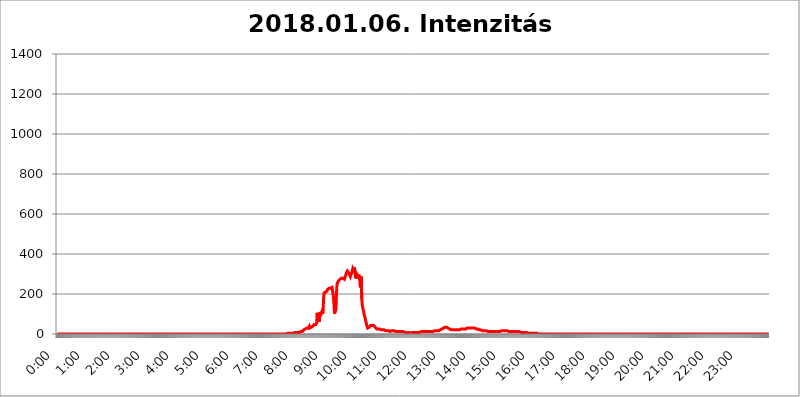
| Category | 2018.01.06. Intenzitás [W/m^2] |
|---|---|
| 0.0 | 0 |
| 0.0006944444444444445 | 0 |
| 0.001388888888888889 | 0 |
| 0.0020833333333333333 | 0 |
| 0.002777777777777778 | 0 |
| 0.003472222222222222 | 0 |
| 0.004166666666666667 | 0 |
| 0.004861111111111111 | 0 |
| 0.005555555555555556 | 0 |
| 0.0062499999999999995 | 0 |
| 0.006944444444444444 | 0 |
| 0.007638888888888889 | 0 |
| 0.008333333333333333 | 0 |
| 0.009027777777777779 | 0 |
| 0.009722222222222222 | 0 |
| 0.010416666666666666 | 0 |
| 0.011111111111111112 | 0 |
| 0.011805555555555555 | 0 |
| 0.012499999999999999 | 0 |
| 0.013194444444444444 | 0 |
| 0.013888888888888888 | 0 |
| 0.014583333333333332 | 0 |
| 0.015277777777777777 | 0 |
| 0.015972222222222224 | 0 |
| 0.016666666666666666 | 0 |
| 0.017361111111111112 | 0 |
| 0.018055555555555557 | 0 |
| 0.01875 | 0 |
| 0.019444444444444445 | 0 |
| 0.02013888888888889 | 0 |
| 0.020833333333333332 | 0 |
| 0.02152777777777778 | 0 |
| 0.022222222222222223 | 0 |
| 0.02291666666666667 | 0 |
| 0.02361111111111111 | 0 |
| 0.024305555555555556 | 0 |
| 0.024999999999999998 | 0 |
| 0.025694444444444447 | 0 |
| 0.02638888888888889 | 0 |
| 0.027083333333333334 | 0 |
| 0.027777777777777776 | 0 |
| 0.02847222222222222 | 0 |
| 0.029166666666666664 | 0 |
| 0.029861111111111113 | 0 |
| 0.030555555555555555 | 0 |
| 0.03125 | 0 |
| 0.03194444444444445 | 0 |
| 0.03263888888888889 | 0 |
| 0.03333333333333333 | 0 |
| 0.034027777777777775 | 0 |
| 0.034722222222222224 | 0 |
| 0.035416666666666666 | 0 |
| 0.036111111111111115 | 0 |
| 0.03680555555555556 | 0 |
| 0.0375 | 0 |
| 0.03819444444444444 | 0 |
| 0.03888888888888889 | 0 |
| 0.03958333333333333 | 0 |
| 0.04027777777777778 | 0 |
| 0.04097222222222222 | 0 |
| 0.041666666666666664 | 0 |
| 0.042361111111111106 | 0 |
| 0.04305555555555556 | 0 |
| 0.043750000000000004 | 0 |
| 0.044444444444444446 | 0 |
| 0.04513888888888889 | 0 |
| 0.04583333333333334 | 0 |
| 0.04652777777777778 | 0 |
| 0.04722222222222222 | 0 |
| 0.04791666666666666 | 0 |
| 0.04861111111111111 | 0 |
| 0.049305555555555554 | 0 |
| 0.049999999999999996 | 0 |
| 0.05069444444444445 | 0 |
| 0.051388888888888894 | 0 |
| 0.052083333333333336 | 0 |
| 0.05277777777777778 | 0 |
| 0.05347222222222222 | 0 |
| 0.05416666666666667 | 0 |
| 0.05486111111111111 | 0 |
| 0.05555555555555555 | 0 |
| 0.05625 | 0 |
| 0.05694444444444444 | 0 |
| 0.057638888888888885 | 0 |
| 0.05833333333333333 | 0 |
| 0.05902777777777778 | 0 |
| 0.059722222222222225 | 0 |
| 0.06041666666666667 | 0 |
| 0.061111111111111116 | 0 |
| 0.06180555555555556 | 0 |
| 0.0625 | 0 |
| 0.06319444444444444 | 0 |
| 0.06388888888888888 | 0 |
| 0.06458333333333334 | 0 |
| 0.06527777777777778 | 0 |
| 0.06597222222222222 | 0 |
| 0.06666666666666667 | 0 |
| 0.06736111111111111 | 0 |
| 0.06805555555555555 | 0 |
| 0.06874999999999999 | 0 |
| 0.06944444444444443 | 0 |
| 0.07013888888888889 | 0 |
| 0.07083333333333333 | 0 |
| 0.07152777777777779 | 0 |
| 0.07222222222222223 | 0 |
| 0.07291666666666667 | 0 |
| 0.07361111111111111 | 0 |
| 0.07430555555555556 | 0 |
| 0.075 | 0 |
| 0.07569444444444444 | 0 |
| 0.0763888888888889 | 0 |
| 0.07708333333333334 | 0 |
| 0.07777777777777778 | 0 |
| 0.07847222222222222 | 0 |
| 0.07916666666666666 | 0 |
| 0.0798611111111111 | 0 |
| 0.08055555555555556 | 0 |
| 0.08125 | 0 |
| 0.08194444444444444 | 0 |
| 0.08263888888888889 | 0 |
| 0.08333333333333333 | 0 |
| 0.08402777777777777 | 0 |
| 0.08472222222222221 | 0 |
| 0.08541666666666665 | 0 |
| 0.08611111111111112 | 0 |
| 0.08680555555555557 | 0 |
| 0.08750000000000001 | 0 |
| 0.08819444444444445 | 0 |
| 0.08888888888888889 | 0 |
| 0.08958333333333333 | 0 |
| 0.09027777777777778 | 0 |
| 0.09097222222222222 | 0 |
| 0.09166666666666667 | 0 |
| 0.09236111111111112 | 0 |
| 0.09305555555555556 | 0 |
| 0.09375 | 0 |
| 0.09444444444444444 | 0 |
| 0.09513888888888888 | 0 |
| 0.09583333333333333 | 0 |
| 0.09652777777777777 | 0 |
| 0.09722222222222222 | 0 |
| 0.09791666666666667 | 0 |
| 0.09861111111111111 | 0 |
| 0.09930555555555555 | 0 |
| 0.09999999999999999 | 0 |
| 0.10069444444444443 | 0 |
| 0.1013888888888889 | 0 |
| 0.10208333333333335 | 0 |
| 0.10277777777777779 | 0 |
| 0.10347222222222223 | 0 |
| 0.10416666666666667 | 0 |
| 0.10486111111111111 | 0 |
| 0.10555555555555556 | 0 |
| 0.10625 | 0 |
| 0.10694444444444444 | 0 |
| 0.1076388888888889 | 0 |
| 0.10833333333333334 | 0 |
| 0.10902777777777778 | 0 |
| 0.10972222222222222 | 0 |
| 0.1111111111111111 | 0 |
| 0.11180555555555556 | 0 |
| 0.11180555555555556 | 0 |
| 0.1125 | 0 |
| 0.11319444444444444 | 0 |
| 0.11388888888888889 | 0 |
| 0.11458333333333333 | 0 |
| 0.11527777777777777 | 0 |
| 0.11597222222222221 | 0 |
| 0.11666666666666665 | 0 |
| 0.1173611111111111 | 0 |
| 0.11805555555555557 | 0 |
| 0.11944444444444445 | 0 |
| 0.12013888888888889 | 0 |
| 0.12083333333333333 | 0 |
| 0.12152777777777778 | 0 |
| 0.12222222222222223 | 0 |
| 0.12291666666666667 | 0 |
| 0.12291666666666667 | 0 |
| 0.12361111111111112 | 0 |
| 0.12430555555555556 | 0 |
| 0.125 | 0 |
| 0.12569444444444444 | 0 |
| 0.12638888888888888 | 0 |
| 0.12708333333333333 | 0 |
| 0.16875 | 0 |
| 0.12847222222222224 | 0 |
| 0.12916666666666668 | 0 |
| 0.12986111111111112 | 0 |
| 0.13055555555555556 | 0 |
| 0.13125 | 0 |
| 0.13194444444444445 | 0 |
| 0.1326388888888889 | 0 |
| 0.13333333333333333 | 0 |
| 0.13402777777777777 | 0 |
| 0.13402777777777777 | 0 |
| 0.13472222222222222 | 0 |
| 0.13541666666666666 | 0 |
| 0.1361111111111111 | 0 |
| 0.13749999999999998 | 0 |
| 0.13819444444444443 | 0 |
| 0.1388888888888889 | 0 |
| 0.13958333333333334 | 0 |
| 0.14027777777777778 | 0 |
| 0.14097222222222222 | 0 |
| 0.14166666666666666 | 0 |
| 0.1423611111111111 | 0 |
| 0.14305555555555557 | 0 |
| 0.14375000000000002 | 0 |
| 0.14444444444444446 | 0 |
| 0.1451388888888889 | 0 |
| 0.1451388888888889 | 0 |
| 0.14652777777777778 | 0 |
| 0.14722222222222223 | 0 |
| 0.14791666666666667 | 0 |
| 0.1486111111111111 | 0 |
| 0.14930555555555555 | 0 |
| 0.15 | 0 |
| 0.15069444444444444 | 0 |
| 0.15138888888888888 | 0 |
| 0.15208333333333332 | 0 |
| 0.15277777777777776 | 0 |
| 0.15347222222222223 | 0 |
| 0.15416666666666667 | 0 |
| 0.15486111111111112 | 0 |
| 0.15555555555555556 | 0 |
| 0.15625 | 0 |
| 0.15694444444444444 | 0 |
| 0.15763888888888888 | 0 |
| 0.15833333333333333 | 0 |
| 0.15902777777777777 | 0 |
| 0.15972222222222224 | 0 |
| 0.16041666666666668 | 0 |
| 0.16111111111111112 | 0 |
| 0.16180555555555556 | 0 |
| 0.1625 | 0 |
| 0.16319444444444445 | 0 |
| 0.1638888888888889 | 0 |
| 0.16458333333333333 | 0 |
| 0.16527777777777777 | 0 |
| 0.16597222222222222 | 0 |
| 0.16666666666666666 | 0 |
| 0.1673611111111111 | 0 |
| 0.16805555555555554 | 0 |
| 0.16874999999999998 | 0 |
| 0.16944444444444443 | 0 |
| 0.17013888888888887 | 0 |
| 0.1708333333333333 | 0 |
| 0.17152777777777775 | 0 |
| 0.17222222222222225 | 0 |
| 0.1729166666666667 | 0 |
| 0.17361111111111113 | 0 |
| 0.17430555555555557 | 0 |
| 0.17500000000000002 | 0 |
| 0.17569444444444446 | 0 |
| 0.1763888888888889 | 0 |
| 0.17708333333333334 | 0 |
| 0.17777777777777778 | 0 |
| 0.17847222222222223 | 0 |
| 0.17916666666666667 | 0 |
| 0.1798611111111111 | 0 |
| 0.18055555555555555 | 0 |
| 0.18125 | 0 |
| 0.18194444444444444 | 0 |
| 0.1826388888888889 | 0 |
| 0.18333333333333335 | 0 |
| 0.1840277777777778 | 0 |
| 0.18472222222222223 | 0 |
| 0.18541666666666667 | 0 |
| 0.18611111111111112 | 0 |
| 0.18680555555555556 | 0 |
| 0.1875 | 0 |
| 0.18819444444444444 | 0 |
| 0.18888888888888888 | 0 |
| 0.18958333333333333 | 0 |
| 0.19027777777777777 | 0 |
| 0.1909722222222222 | 0 |
| 0.19166666666666665 | 0 |
| 0.19236111111111112 | 0 |
| 0.19305555555555554 | 0 |
| 0.19375 | 0 |
| 0.19444444444444445 | 0 |
| 0.1951388888888889 | 0 |
| 0.19583333333333333 | 0 |
| 0.19652777777777777 | 0 |
| 0.19722222222222222 | 0 |
| 0.19791666666666666 | 0 |
| 0.1986111111111111 | 0 |
| 0.19930555555555554 | 0 |
| 0.19999999999999998 | 0 |
| 0.20069444444444443 | 0 |
| 0.20138888888888887 | 0 |
| 0.2020833333333333 | 0 |
| 0.2027777777777778 | 0 |
| 0.2034722222222222 | 0 |
| 0.2041666666666667 | 0 |
| 0.20486111111111113 | 0 |
| 0.20555555555555557 | 0 |
| 0.20625000000000002 | 0 |
| 0.20694444444444446 | 0 |
| 0.2076388888888889 | 0 |
| 0.20833333333333334 | 0 |
| 0.20902777777777778 | 0 |
| 0.20972222222222223 | 0 |
| 0.21041666666666667 | 0 |
| 0.2111111111111111 | 0 |
| 0.21180555555555555 | 0 |
| 0.2125 | 0 |
| 0.21319444444444444 | 0 |
| 0.2138888888888889 | 0 |
| 0.21458333333333335 | 0 |
| 0.2152777777777778 | 0 |
| 0.21597222222222223 | 0 |
| 0.21666666666666667 | 0 |
| 0.21736111111111112 | 0 |
| 0.21805555555555556 | 0 |
| 0.21875 | 0 |
| 0.21944444444444444 | 0 |
| 0.22013888888888888 | 0 |
| 0.22083333333333333 | 0 |
| 0.22152777777777777 | 0 |
| 0.2222222222222222 | 0 |
| 0.22291666666666665 | 0 |
| 0.2236111111111111 | 0 |
| 0.22430555555555556 | 0 |
| 0.225 | 0 |
| 0.22569444444444445 | 0 |
| 0.2263888888888889 | 0 |
| 0.22708333333333333 | 0 |
| 0.22777777777777777 | 0 |
| 0.22847222222222222 | 0 |
| 0.22916666666666666 | 0 |
| 0.2298611111111111 | 0 |
| 0.23055555555555554 | 0 |
| 0.23124999999999998 | 0 |
| 0.23194444444444443 | 0 |
| 0.23263888888888887 | 0 |
| 0.2333333333333333 | 0 |
| 0.2340277777777778 | 0 |
| 0.2347222222222222 | 0 |
| 0.2354166666666667 | 0 |
| 0.23611111111111113 | 0 |
| 0.23680555555555557 | 0 |
| 0.23750000000000002 | 0 |
| 0.23819444444444446 | 0 |
| 0.2388888888888889 | 0 |
| 0.23958333333333334 | 0 |
| 0.24027777777777778 | 0 |
| 0.24097222222222223 | 0 |
| 0.24166666666666667 | 0 |
| 0.2423611111111111 | 0 |
| 0.24305555555555555 | 0 |
| 0.24375 | 0 |
| 0.24444444444444446 | 0 |
| 0.24513888888888888 | 0 |
| 0.24583333333333335 | 0 |
| 0.2465277777777778 | 0 |
| 0.24722222222222223 | 0 |
| 0.24791666666666667 | 0 |
| 0.24861111111111112 | 0 |
| 0.24930555555555556 | 0 |
| 0.25 | 0 |
| 0.25069444444444444 | 0 |
| 0.2513888888888889 | 0 |
| 0.2520833333333333 | 0 |
| 0.25277777777777777 | 0 |
| 0.2534722222222222 | 0 |
| 0.25416666666666665 | 0 |
| 0.2548611111111111 | 0 |
| 0.2555555555555556 | 0 |
| 0.25625000000000003 | 0 |
| 0.2569444444444445 | 0 |
| 0.2576388888888889 | 0 |
| 0.25833333333333336 | 0 |
| 0.2590277777777778 | 0 |
| 0.25972222222222224 | 0 |
| 0.2604166666666667 | 0 |
| 0.2611111111111111 | 0 |
| 0.26180555555555557 | 0 |
| 0.2625 | 0 |
| 0.26319444444444445 | 0 |
| 0.2638888888888889 | 0 |
| 0.26458333333333334 | 0 |
| 0.2652777777777778 | 0 |
| 0.2659722222222222 | 0 |
| 0.26666666666666666 | 0 |
| 0.2673611111111111 | 0 |
| 0.26805555555555555 | 0 |
| 0.26875 | 0 |
| 0.26944444444444443 | 0 |
| 0.2701388888888889 | 0 |
| 0.2708333333333333 | 0 |
| 0.27152777777777776 | 0 |
| 0.2722222222222222 | 0 |
| 0.27291666666666664 | 0 |
| 0.2736111111111111 | 0 |
| 0.2743055555555555 | 0 |
| 0.27499999999999997 | 0 |
| 0.27569444444444446 | 0 |
| 0.27638888888888885 | 0 |
| 0.27708333333333335 | 0 |
| 0.2777777777777778 | 0 |
| 0.27847222222222223 | 0 |
| 0.2791666666666667 | 0 |
| 0.2798611111111111 | 0 |
| 0.28055555555555556 | 0 |
| 0.28125 | 0 |
| 0.28194444444444444 | 0 |
| 0.2826388888888889 | 0 |
| 0.2833333333333333 | 0 |
| 0.28402777777777777 | 0 |
| 0.2847222222222222 | 0 |
| 0.28541666666666665 | 0 |
| 0.28611111111111115 | 0 |
| 0.28680555555555554 | 0 |
| 0.28750000000000003 | 0 |
| 0.2881944444444445 | 0 |
| 0.2888888888888889 | 0 |
| 0.28958333333333336 | 0 |
| 0.2902777777777778 | 0 |
| 0.29097222222222224 | 0 |
| 0.2916666666666667 | 0 |
| 0.2923611111111111 | 0 |
| 0.29305555555555557 | 0 |
| 0.29375 | 0 |
| 0.29444444444444445 | 0 |
| 0.2951388888888889 | 0 |
| 0.29583333333333334 | 0 |
| 0.2965277777777778 | 0 |
| 0.2972222222222222 | 0 |
| 0.29791666666666666 | 0 |
| 0.2986111111111111 | 0 |
| 0.29930555555555555 | 0 |
| 0.3 | 0 |
| 0.30069444444444443 | 0 |
| 0.3013888888888889 | 0 |
| 0.3020833333333333 | 0 |
| 0.30277777777777776 | 0 |
| 0.3034722222222222 | 0 |
| 0.30416666666666664 | 0 |
| 0.3048611111111111 | 0 |
| 0.3055555555555555 | 0 |
| 0.30624999999999997 | 0 |
| 0.3069444444444444 | 0 |
| 0.3076388888888889 | 0 |
| 0.30833333333333335 | 0 |
| 0.3090277777777778 | 0 |
| 0.30972222222222223 | 0 |
| 0.3104166666666667 | 0 |
| 0.3111111111111111 | 0 |
| 0.31180555555555556 | 0 |
| 0.3125 | 0 |
| 0.31319444444444444 | 0 |
| 0.3138888888888889 | 0 |
| 0.3145833333333333 | 0 |
| 0.31527777777777777 | 0 |
| 0.3159722222222222 | 0 |
| 0.31666666666666665 | 0 |
| 0.31736111111111115 | 0 |
| 0.31805555555555554 | 0 |
| 0.31875000000000003 | 0 |
| 0.3194444444444445 | 0 |
| 0.3201388888888889 | 0 |
| 0.32083333333333336 | 0 |
| 0.3215277777777778 | 3.525 |
| 0.32222222222222224 | 3.525 |
| 0.3229166666666667 | 3.525 |
| 0.3236111111111111 | 3.525 |
| 0.32430555555555557 | 3.525 |
| 0.325 | 3.525 |
| 0.32569444444444445 | 3.525 |
| 0.3263888888888889 | 3.525 |
| 0.32708333333333334 | 3.525 |
| 0.3277777777777778 | 3.525 |
| 0.3284722222222222 | 3.525 |
| 0.32916666666666666 | 3.525 |
| 0.3298611111111111 | 3.525 |
| 0.33055555555555555 | 3.525 |
| 0.33125 | 3.525 |
| 0.33194444444444443 | 3.525 |
| 0.3326388888888889 | 3.525 |
| 0.3333333333333333 | 7.887 |
| 0.3340277777777778 | 7.887 |
| 0.3347222222222222 | 7.887 |
| 0.3354166666666667 | 7.887 |
| 0.3361111111111111 | 7.887 |
| 0.3368055555555556 | 7.887 |
| 0.33749999999999997 | 7.887 |
| 0.33819444444444446 | 7.887 |
| 0.33888888888888885 | 7.887 |
| 0.33958333333333335 | 7.887 |
| 0.34027777777777773 | 7.887 |
| 0.34097222222222223 | 12.257 |
| 0.3416666666666666 | 12.257 |
| 0.3423611111111111 | 12.257 |
| 0.3430555555555555 | 12.257 |
| 0.34375 | 12.257 |
| 0.3444444444444445 | 16.636 |
| 0.3451388888888889 | 16.636 |
| 0.3458333333333334 | 21.024 |
| 0.34652777777777777 | 21.024 |
| 0.34722222222222227 | 21.024 |
| 0.34791666666666665 | 25.419 |
| 0.34861111111111115 | 25.419 |
| 0.34930555555555554 | 25.419 |
| 0.35000000000000003 | 29.823 |
| 0.3506944444444444 | 29.823 |
| 0.3513888888888889 | 34.234 |
| 0.3520833333333333 | 29.823 |
| 0.3527777777777778 | 29.823 |
| 0.3534722222222222 | 38.653 |
| 0.3541666666666667 | 29.823 |
| 0.3548611111111111 | 29.823 |
| 0.35555555555555557 | 29.823 |
| 0.35625 | 34.234 |
| 0.35694444444444445 | 34.234 |
| 0.3576388888888889 | 38.653 |
| 0.35833333333333334 | 38.653 |
| 0.3590277777777778 | 43.079 |
| 0.3597222222222222 | 43.079 |
| 0.36041666666666666 | 47.511 |
| 0.3611111111111111 | 43.079 |
| 0.36180555555555555 | 43.079 |
| 0.3625 | 47.511 |
| 0.36319444444444443 | 47.511 |
| 0.3638888888888889 | 56.398 |
| 0.3645833333333333 | 105.69 |
| 0.3652777777777778 | 83.205 |
| 0.3659722222222222 | 60.85 |
| 0.3666666666666667 | 74.246 |
| 0.3673611111111111 | 60.85 |
| 0.3680555555555556 | 65.31 |
| 0.36874999999999997 | 110.201 |
| 0.36944444444444446 | 92.184 |
| 0.37013888888888885 | 105.69 |
| 0.37083333333333335 | 110.201 |
| 0.37152777777777773 | 114.716 |
| 0.37222222222222223 | 101.184 |
| 0.3729166666666666 | 128.284 |
| 0.3736111111111111 | 178.264 |
| 0.3743055555555555 | 205.62 |
| 0.375 | 205.62 |
| 0.3756944444444445 | 210.182 |
| 0.3763888888888889 | 210.182 |
| 0.3770833333333334 | 210.182 |
| 0.37777777777777777 | 214.746 |
| 0.37847222222222227 | 214.746 |
| 0.37916666666666665 | 223.873 |
| 0.37986111111111115 | 223.873 |
| 0.38055555555555554 | 228.436 |
| 0.38125000000000003 | 228.436 |
| 0.3819444444444444 | 233 |
| 0.3826388888888889 | 233 |
| 0.3833333333333333 | 228.436 |
| 0.3840277777777778 | 228.436 |
| 0.3847222222222222 | 228.436 |
| 0.3854166666666667 | 233 |
| 0.3861111111111111 | 237.564 |
| 0.38680555555555557 | 228.436 |
| 0.3875 | 182.82 |
| 0.38819444444444445 | 141.884 |
| 0.3888888888888889 | 101.184 |
| 0.38958333333333334 | 101.184 |
| 0.3902777777777778 | 101.184 |
| 0.3909722222222222 | 128.284 |
| 0.39166666666666666 | 205.62 |
| 0.3923611111111111 | 246.689 |
| 0.39305555555555555 | 255.813 |
| 0.39375 | 260.373 |
| 0.39444444444444443 | 264.932 |
| 0.3951388888888889 | 264.932 |
| 0.3958333333333333 | 264.932 |
| 0.3965277777777778 | 274.047 |
| 0.3972222222222222 | 274.047 |
| 0.3979166666666667 | 278.603 |
| 0.3986111111111111 | 278.603 |
| 0.3993055555555556 | 278.603 |
| 0.39999999999999997 | 278.603 |
| 0.40069444444444446 | 278.603 |
| 0.40138888888888885 | 274.047 |
| 0.40208333333333335 | 274.047 |
| 0.40277777777777773 | 274.047 |
| 0.40347222222222223 | 283.156 |
| 0.4041666666666666 | 287.709 |
| 0.4048611111111111 | 296.808 |
| 0.4055555555555555 | 305.898 |
| 0.40625 | 305.898 |
| 0.4069444444444445 | 314.98 |
| 0.4076388888888889 | 314.98 |
| 0.4083333333333334 | 314.98 |
| 0.40902777777777777 | 305.898 |
| 0.40972222222222227 | 301.354 |
| 0.41041666666666665 | 301.354 |
| 0.41111111111111115 | 287.709 |
| 0.41180555555555554 | 296.808 |
| 0.41250000000000003 | 301.354 |
| 0.4131944444444444 | 305.898 |
| 0.4138888888888889 | 305.898 |
| 0.4145833333333333 | 328.584 |
| 0.4152777777777778 | 333.113 |
| 0.4159722222222222 | 319.517 |
| 0.4166666666666667 | 333.113 |
| 0.4173611111111111 | 314.98 |
| 0.41805555555555557 | 287.709 |
| 0.41875 | 278.603 |
| 0.41944444444444445 | 292.259 |
| 0.4201388888888889 | 278.603 |
| 0.42083333333333334 | 296.808 |
| 0.4215277777777778 | 292.259 |
| 0.4222222222222222 | 287.709 |
| 0.42291666666666666 | 296.808 |
| 0.4236111111111111 | 292.259 |
| 0.42430555555555555 | 274.047 |
| 0.425 | 233 |
| 0.42569444444444443 | 242.127 |
| 0.4263888888888889 | 287.709 |
| 0.4270833333333333 | 178.264 |
| 0.4277777777777778 | 146.423 |
| 0.4284722222222222 | 132.814 |
| 0.4291666666666667 | 119.235 |
| 0.4298611111111111 | 110.201 |
| 0.4305555555555556 | 96.682 |
| 0.43124999999999997 | 87.692 |
| 0.43194444444444446 | 78.722 |
| 0.43263888888888885 | 65.31 |
| 0.43333333333333335 | 56.398 |
| 0.43402777777777773 | 43.079 |
| 0.43472222222222223 | 38.653 |
| 0.4354166666666666 | 29.823 |
| 0.4361111111111111 | 29.823 |
| 0.4368055555555555 | 29.823 |
| 0.4375 | 34.234 |
| 0.4381944444444445 | 38.653 |
| 0.4388888888888889 | 38.653 |
| 0.4395833333333334 | 43.079 |
| 0.44027777777777777 | 43.079 |
| 0.44097222222222227 | 43.079 |
| 0.44166666666666665 | 43.079 |
| 0.44236111111111115 | 43.079 |
| 0.44305555555555554 | 43.079 |
| 0.44375000000000003 | 43.079 |
| 0.4444444444444444 | 38.653 |
| 0.4451388888888889 | 38.653 |
| 0.4458333333333333 | 34.234 |
| 0.4465277777777778 | 29.823 |
| 0.4472222222222222 | 29.823 |
| 0.4479166666666667 | 25.419 |
| 0.4486111111111111 | 25.419 |
| 0.44930555555555557 | 25.419 |
| 0.45 | 25.419 |
| 0.45069444444444445 | 25.419 |
| 0.4513888888888889 | 25.419 |
| 0.45208333333333334 | 25.419 |
| 0.4527777777777778 | 25.419 |
| 0.4534722222222222 | 25.419 |
| 0.45416666666666666 | 21.024 |
| 0.4548611111111111 | 21.024 |
| 0.45555555555555555 | 21.024 |
| 0.45625 | 21.024 |
| 0.45694444444444443 | 21.024 |
| 0.4576388888888889 | 21.024 |
| 0.4583333333333333 | 21.024 |
| 0.4590277777777778 | 21.024 |
| 0.4597222222222222 | 21.024 |
| 0.4604166666666667 | 16.636 |
| 0.4611111111111111 | 16.636 |
| 0.4618055555555556 | 16.636 |
| 0.46249999999999997 | 16.636 |
| 0.46319444444444446 | 16.636 |
| 0.46388888888888885 | 12.257 |
| 0.46458333333333335 | 16.636 |
| 0.46527777777777773 | 16.636 |
| 0.46597222222222223 | 16.636 |
| 0.4666666666666666 | 12.257 |
| 0.4673611111111111 | 16.636 |
| 0.4680555555555555 | 16.636 |
| 0.46875 | 16.636 |
| 0.4694444444444445 | 16.636 |
| 0.4701388888888889 | 16.636 |
| 0.4708333333333334 | 16.636 |
| 0.47152777777777777 | 16.636 |
| 0.47222222222222227 | 16.636 |
| 0.47291666666666665 | 16.636 |
| 0.47361111111111115 | 16.636 |
| 0.47430555555555554 | 16.636 |
| 0.47500000000000003 | 12.257 |
| 0.4756944444444444 | 12.257 |
| 0.4763888888888889 | 12.257 |
| 0.4770833333333333 | 12.257 |
| 0.4777777777777778 | 12.257 |
| 0.4784722222222222 | 12.257 |
| 0.4791666666666667 | 12.257 |
| 0.4798611111111111 | 12.257 |
| 0.48055555555555557 | 12.257 |
| 0.48125 | 12.257 |
| 0.48194444444444445 | 12.257 |
| 0.4826388888888889 | 12.257 |
| 0.48333333333333334 | 12.257 |
| 0.4840277777777778 | 12.257 |
| 0.4847222222222222 | 12.257 |
| 0.48541666666666666 | 12.257 |
| 0.4861111111111111 | 7.887 |
| 0.48680555555555555 | 7.887 |
| 0.4875 | 7.887 |
| 0.48819444444444443 | 7.887 |
| 0.4888888888888889 | 7.887 |
| 0.4895833333333333 | 7.887 |
| 0.4902777777777778 | 7.887 |
| 0.4909722222222222 | 7.887 |
| 0.4916666666666667 | 7.887 |
| 0.4923611111111111 | 7.887 |
| 0.4930555555555556 | 7.887 |
| 0.49374999999999997 | 7.887 |
| 0.49444444444444446 | 3.525 |
| 0.49513888888888885 | 3.525 |
| 0.49583333333333335 | 3.525 |
| 0.49652777777777773 | 7.887 |
| 0.49722222222222223 | 3.525 |
| 0.4979166666666666 | 7.887 |
| 0.4986111111111111 | 7.887 |
| 0.4993055555555555 | 7.887 |
| 0.5 | 7.887 |
| 0.5006944444444444 | 7.887 |
| 0.5013888888888889 | 7.887 |
| 0.5020833333333333 | 7.887 |
| 0.5027777777777778 | 7.887 |
| 0.5034722222222222 | 7.887 |
| 0.5041666666666667 | 7.887 |
| 0.5048611111111111 | 7.887 |
| 0.5055555555555555 | 7.887 |
| 0.50625 | 7.887 |
| 0.5069444444444444 | 7.887 |
| 0.5076388888888889 | 7.887 |
| 0.5083333333333333 | 7.887 |
| 0.5090277777777777 | 7.887 |
| 0.5097222222222222 | 7.887 |
| 0.5104166666666666 | 12.257 |
| 0.5111111111111112 | 7.887 |
| 0.5118055555555555 | 12.257 |
| 0.5125000000000001 | 12.257 |
| 0.5131944444444444 | 12.257 |
| 0.513888888888889 | 12.257 |
| 0.5145833333333333 | 12.257 |
| 0.5152777777777778 | 12.257 |
| 0.5159722222222222 | 12.257 |
| 0.5166666666666667 | 12.257 |
| 0.517361111111111 | 12.257 |
| 0.5180555555555556 | 12.257 |
| 0.5187499999999999 | 12.257 |
| 0.5194444444444445 | 12.257 |
| 0.5201388888888888 | 12.257 |
| 0.5208333333333334 | 12.257 |
| 0.5215277777777778 | 12.257 |
| 0.5222222222222223 | 12.257 |
| 0.5229166666666667 | 12.257 |
| 0.5236111111111111 | 12.257 |
| 0.5243055555555556 | 12.257 |
| 0.525 | 12.257 |
| 0.5256944444444445 | 12.257 |
| 0.5263888888888889 | 12.257 |
| 0.5270833333333333 | 12.257 |
| 0.5277777777777778 | 12.257 |
| 0.5284722222222222 | 12.257 |
| 0.5291666666666667 | 16.636 |
| 0.5298611111111111 | 16.636 |
| 0.5305555555555556 | 16.636 |
| 0.53125 | 16.636 |
| 0.5319444444444444 | 16.636 |
| 0.5326388888888889 | 12.257 |
| 0.5333333333333333 | 16.636 |
| 0.5340277777777778 | 16.636 |
| 0.5347222222222222 | 16.636 |
| 0.5354166666666667 | 16.636 |
| 0.5361111111111111 | 16.636 |
| 0.5368055555555555 | 21.024 |
| 0.5375 | 21.024 |
| 0.5381944444444444 | 21.024 |
| 0.5388888888888889 | 21.024 |
| 0.5395833333333333 | 25.419 |
| 0.5402777777777777 | 25.419 |
| 0.5409722222222222 | 29.823 |
| 0.5416666666666666 | 29.823 |
| 0.5423611111111112 | 34.234 |
| 0.5430555555555555 | 34.234 |
| 0.5437500000000001 | 34.234 |
| 0.5444444444444444 | 34.234 |
| 0.545138888888889 | 34.234 |
| 0.5458333333333333 | 34.234 |
| 0.5465277777777778 | 29.823 |
| 0.5472222222222222 | 29.823 |
| 0.5479166666666667 | 29.823 |
| 0.548611111111111 | 25.419 |
| 0.5493055555555556 | 25.419 |
| 0.5499999999999999 | 25.419 |
| 0.5506944444444445 | 21.024 |
| 0.5513888888888888 | 21.024 |
| 0.5520833333333334 | 21.024 |
| 0.5527777777777778 | 21.024 |
| 0.5534722222222223 | 21.024 |
| 0.5541666666666667 | 21.024 |
| 0.5548611111111111 | 21.024 |
| 0.5555555555555556 | 21.024 |
| 0.55625 | 21.024 |
| 0.5569444444444445 | 21.024 |
| 0.5576388888888889 | 21.024 |
| 0.5583333333333333 | 21.024 |
| 0.5590277777777778 | 21.024 |
| 0.5597222222222222 | 21.024 |
| 0.5604166666666667 | 21.024 |
| 0.5611111111111111 | 21.024 |
| 0.5618055555555556 | 21.024 |
| 0.5625 | 21.024 |
| 0.5631944444444444 | 21.024 |
| 0.5638888888888889 | 21.024 |
| 0.5645833333333333 | 21.024 |
| 0.5652777777777778 | 21.024 |
| 0.5659722222222222 | 21.024 |
| 0.5666666666666667 | 25.419 |
| 0.5673611111111111 | 25.419 |
| 0.5680555555555555 | 25.419 |
| 0.56875 | 25.419 |
| 0.5694444444444444 | 25.419 |
| 0.5701388888888889 | 25.419 |
| 0.5708333333333333 | 25.419 |
| 0.5715277777777777 | 25.419 |
| 0.5722222222222222 | 25.419 |
| 0.5729166666666666 | 25.419 |
| 0.5736111111111112 | 25.419 |
| 0.5743055555555555 | 25.419 |
| 0.5750000000000001 | 29.823 |
| 0.5756944444444444 | 29.823 |
| 0.576388888888889 | 29.823 |
| 0.5770833333333333 | 29.823 |
| 0.5777777777777778 | 29.823 |
| 0.5784722222222222 | 29.823 |
| 0.5791666666666667 | 29.823 |
| 0.579861111111111 | 29.823 |
| 0.5805555555555556 | 29.823 |
| 0.5812499999999999 | 29.823 |
| 0.5819444444444445 | 29.823 |
| 0.5826388888888888 | 29.823 |
| 0.5833333333333334 | 29.823 |
| 0.5840277777777778 | 29.823 |
| 0.5847222222222223 | 29.823 |
| 0.5854166666666667 | 29.823 |
| 0.5861111111111111 | 29.823 |
| 0.5868055555555556 | 29.823 |
| 0.5875 | 25.419 |
| 0.5881944444444445 | 25.419 |
| 0.5888888888888889 | 25.419 |
| 0.5895833333333333 | 25.419 |
| 0.5902777777777778 | 25.419 |
| 0.5909722222222222 | 21.024 |
| 0.5916666666666667 | 21.024 |
| 0.5923611111111111 | 21.024 |
| 0.5930555555555556 | 21.024 |
| 0.59375 | 21.024 |
| 0.5944444444444444 | 16.636 |
| 0.5951388888888889 | 16.636 |
| 0.5958333333333333 | 16.636 |
| 0.5965277777777778 | 16.636 |
| 0.5972222222222222 | 16.636 |
| 0.5979166666666667 | 16.636 |
| 0.5986111111111111 | 16.636 |
| 0.5993055555555555 | 16.636 |
| 0.6 | 16.636 |
| 0.6006944444444444 | 16.636 |
| 0.6013888888888889 | 16.636 |
| 0.6020833333333333 | 16.636 |
| 0.6027777777777777 | 12.257 |
| 0.6034722222222222 | 12.257 |
| 0.6041666666666666 | 12.257 |
| 0.6048611111111112 | 12.257 |
| 0.6055555555555555 | 12.257 |
| 0.6062500000000001 | 12.257 |
| 0.6069444444444444 | 12.257 |
| 0.607638888888889 | 12.257 |
| 0.6083333333333333 | 12.257 |
| 0.6090277777777778 | 16.636 |
| 0.6097222222222222 | 12.257 |
| 0.6104166666666667 | 12.257 |
| 0.611111111111111 | 12.257 |
| 0.6118055555555556 | 12.257 |
| 0.6124999999999999 | 12.257 |
| 0.6131944444444445 | 12.257 |
| 0.6138888888888888 | 12.257 |
| 0.6145833333333334 | 12.257 |
| 0.6152777777777778 | 12.257 |
| 0.6159722222222223 | 12.257 |
| 0.6166666666666667 | 12.257 |
| 0.6173611111111111 | 12.257 |
| 0.6180555555555556 | 12.257 |
| 0.61875 | 12.257 |
| 0.6194444444444445 | 12.257 |
| 0.6201388888888889 | 12.257 |
| 0.6208333333333333 | 12.257 |
| 0.6215277777777778 | 12.257 |
| 0.6222222222222222 | 16.636 |
| 0.6229166666666667 | 16.636 |
| 0.6236111111111111 | 16.636 |
| 0.6243055555555556 | 16.636 |
| 0.625 | 16.636 |
| 0.6256944444444444 | 16.636 |
| 0.6263888888888889 | 16.636 |
| 0.6270833333333333 | 16.636 |
| 0.6277777777777778 | 16.636 |
| 0.6284722222222222 | 16.636 |
| 0.6291666666666667 | 16.636 |
| 0.6298611111111111 | 16.636 |
| 0.6305555555555555 | 16.636 |
| 0.63125 | 16.636 |
| 0.6319444444444444 | 12.257 |
| 0.6326388888888889 | 12.257 |
| 0.6333333333333333 | 12.257 |
| 0.6340277777777777 | 12.257 |
| 0.6347222222222222 | 12.257 |
| 0.6354166666666666 | 12.257 |
| 0.6361111111111112 | 12.257 |
| 0.6368055555555555 | 12.257 |
| 0.6375000000000001 | 12.257 |
| 0.6381944444444444 | 7.887 |
| 0.638888888888889 | 7.887 |
| 0.6395833333333333 | 12.257 |
| 0.6402777777777778 | 7.887 |
| 0.6409722222222222 | 12.257 |
| 0.6416666666666667 | 12.257 |
| 0.642361111111111 | 12.257 |
| 0.6430555555555556 | 12.257 |
| 0.6437499999999999 | 12.257 |
| 0.6444444444444445 | 12.257 |
| 0.6451388888888888 | 12.257 |
| 0.6458333333333334 | 12.257 |
| 0.6465277777777778 | 12.257 |
| 0.6472222222222223 | 12.257 |
| 0.6479166666666667 | 12.257 |
| 0.6486111111111111 | 7.887 |
| 0.6493055555555556 | 7.887 |
| 0.65 | 7.887 |
| 0.6506944444444445 | 12.257 |
| 0.6513888888888889 | 12.257 |
| 0.6520833333333333 | 7.887 |
| 0.6527777777777778 | 7.887 |
| 0.6534722222222222 | 7.887 |
| 0.6541666666666667 | 7.887 |
| 0.6548611111111111 | 7.887 |
| 0.6555555555555556 | 7.887 |
| 0.65625 | 7.887 |
| 0.6569444444444444 | 7.887 |
| 0.6576388888888889 | 7.887 |
| 0.6583333333333333 | 7.887 |
| 0.6590277777777778 | 7.887 |
| 0.6597222222222222 | 7.887 |
| 0.6604166666666667 | 3.525 |
| 0.6611111111111111 | 3.525 |
| 0.6618055555555555 | 3.525 |
| 0.6625 | 3.525 |
| 0.6631944444444444 | 3.525 |
| 0.6638888888888889 | 3.525 |
| 0.6645833333333333 | 3.525 |
| 0.6652777777777777 | 3.525 |
| 0.6659722222222222 | 3.525 |
| 0.6666666666666666 | 3.525 |
| 0.6673611111111111 | 3.525 |
| 0.6680555555555556 | 3.525 |
| 0.6687500000000001 | 3.525 |
| 0.6694444444444444 | 3.525 |
| 0.6701388888888888 | 3.525 |
| 0.6708333333333334 | 3.525 |
| 0.6715277777777778 | 3.525 |
| 0.6722222222222222 | 3.525 |
| 0.6729166666666666 | 3.525 |
| 0.6736111111111112 | 3.525 |
| 0.6743055555555556 | 3.525 |
| 0.6749999999999999 | 0 |
| 0.6756944444444444 | 0 |
| 0.6763888888888889 | 0 |
| 0.6770833333333334 | 0 |
| 0.6777777777777777 | 0 |
| 0.6784722222222223 | 0 |
| 0.6791666666666667 | 0 |
| 0.6798611111111111 | 0 |
| 0.6805555555555555 | 0 |
| 0.68125 | 0 |
| 0.6819444444444445 | 0 |
| 0.6826388888888889 | 0 |
| 0.6833333333333332 | 0 |
| 0.6840277777777778 | 0 |
| 0.6847222222222222 | 0 |
| 0.6854166666666667 | 0 |
| 0.686111111111111 | 0 |
| 0.6868055555555556 | 0 |
| 0.6875 | 0 |
| 0.6881944444444444 | 0 |
| 0.688888888888889 | 0 |
| 0.6895833333333333 | 0 |
| 0.6902777777777778 | 0 |
| 0.6909722222222222 | 0 |
| 0.6916666666666668 | 0 |
| 0.6923611111111111 | 0 |
| 0.6930555555555555 | 0 |
| 0.69375 | 0 |
| 0.6944444444444445 | 0 |
| 0.6951388888888889 | 0 |
| 0.6958333333333333 | 0 |
| 0.6965277777777777 | 0 |
| 0.6972222222222223 | 0 |
| 0.6979166666666666 | 0 |
| 0.6986111111111111 | 0 |
| 0.6993055555555556 | 0 |
| 0.7000000000000001 | 0 |
| 0.7006944444444444 | 0 |
| 0.7013888888888888 | 0 |
| 0.7020833333333334 | 0 |
| 0.7027777777777778 | 0 |
| 0.7034722222222222 | 0 |
| 0.7041666666666666 | 0 |
| 0.7048611111111112 | 0 |
| 0.7055555555555556 | 0 |
| 0.7062499999999999 | 0 |
| 0.7069444444444444 | 0 |
| 0.7076388888888889 | 0 |
| 0.7083333333333334 | 0 |
| 0.7090277777777777 | 0 |
| 0.7097222222222223 | 0 |
| 0.7104166666666667 | 0 |
| 0.7111111111111111 | 0 |
| 0.7118055555555555 | 0 |
| 0.7125 | 0 |
| 0.7131944444444445 | 0 |
| 0.7138888888888889 | 0 |
| 0.7145833333333332 | 0 |
| 0.7152777777777778 | 0 |
| 0.7159722222222222 | 0 |
| 0.7166666666666667 | 0 |
| 0.717361111111111 | 0 |
| 0.7180555555555556 | 0 |
| 0.71875 | 0 |
| 0.7194444444444444 | 0 |
| 0.720138888888889 | 0 |
| 0.7208333333333333 | 0 |
| 0.7215277777777778 | 0 |
| 0.7222222222222222 | 0 |
| 0.7229166666666668 | 0 |
| 0.7236111111111111 | 0 |
| 0.7243055555555555 | 0 |
| 0.725 | 0 |
| 0.7256944444444445 | 0 |
| 0.7263888888888889 | 0 |
| 0.7270833333333333 | 0 |
| 0.7277777777777777 | 0 |
| 0.7284722222222223 | 0 |
| 0.7291666666666666 | 0 |
| 0.7298611111111111 | 0 |
| 0.7305555555555556 | 0 |
| 0.7312500000000001 | 0 |
| 0.7319444444444444 | 0 |
| 0.7326388888888888 | 0 |
| 0.7333333333333334 | 0 |
| 0.7340277777777778 | 0 |
| 0.7347222222222222 | 0 |
| 0.7354166666666666 | 0 |
| 0.7361111111111112 | 0 |
| 0.7368055555555556 | 0 |
| 0.7374999999999999 | 0 |
| 0.7381944444444444 | 0 |
| 0.7388888888888889 | 0 |
| 0.7395833333333334 | 0 |
| 0.7402777777777777 | 0 |
| 0.7409722222222223 | 0 |
| 0.7416666666666667 | 0 |
| 0.7423611111111111 | 0 |
| 0.7430555555555555 | 0 |
| 0.74375 | 0 |
| 0.7444444444444445 | 0 |
| 0.7451388888888889 | 0 |
| 0.7458333333333332 | 0 |
| 0.7465277777777778 | 0 |
| 0.7472222222222222 | 0 |
| 0.7479166666666667 | 0 |
| 0.748611111111111 | 0 |
| 0.7493055555555556 | 0 |
| 0.75 | 0 |
| 0.7506944444444444 | 0 |
| 0.751388888888889 | 0 |
| 0.7520833333333333 | 0 |
| 0.7527777777777778 | 0 |
| 0.7534722222222222 | 0 |
| 0.7541666666666668 | 0 |
| 0.7548611111111111 | 0 |
| 0.7555555555555555 | 0 |
| 0.75625 | 0 |
| 0.7569444444444445 | 0 |
| 0.7576388888888889 | 0 |
| 0.7583333333333333 | 0 |
| 0.7590277777777777 | 0 |
| 0.7597222222222223 | 0 |
| 0.7604166666666666 | 0 |
| 0.7611111111111111 | 0 |
| 0.7618055555555556 | 0 |
| 0.7625000000000001 | 0 |
| 0.7631944444444444 | 0 |
| 0.7638888888888888 | 0 |
| 0.7645833333333334 | 0 |
| 0.7652777777777778 | 0 |
| 0.7659722222222222 | 0 |
| 0.7666666666666666 | 0 |
| 0.7673611111111112 | 0 |
| 0.7680555555555556 | 0 |
| 0.7687499999999999 | 0 |
| 0.7694444444444444 | 0 |
| 0.7701388888888889 | 0 |
| 0.7708333333333334 | 0 |
| 0.7715277777777777 | 0 |
| 0.7722222222222223 | 0 |
| 0.7729166666666667 | 0 |
| 0.7736111111111111 | 0 |
| 0.7743055555555555 | 0 |
| 0.775 | 0 |
| 0.7756944444444445 | 0 |
| 0.7763888888888889 | 0 |
| 0.7770833333333332 | 0 |
| 0.7777777777777778 | 0 |
| 0.7784722222222222 | 0 |
| 0.7791666666666667 | 0 |
| 0.779861111111111 | 0 |
| 0.7805555555555556 | 0 |
| 0.78125 | 0 |
| 0.7819444444444444 | 0 |
| 0.782638888888889 | 0 |
| 0.7833333333333333 | 0 |
| 0.7840277777777778 | 0 |
| 0.7847222222222222 | 0 |
| 0.7854166666666668 | 0 |
| 0.7861111111111111 | 0 |
| 0.7868055555555555 | 0 |
| 0.7875 | 0 |
| 0.7881944444444445 | 0 |
| 0.7888888888888889 | 0 |
| 0.7895833333333333 | 0 |
| 0.7902777777777777 | 0 |
| 0.7909722222222223 | 0 |
| 0.7916666666666666 | 0 |
| 0.7923611111111111 | 0 |
| 0.7930555555555556 | 0 |
| 0.7937500000000001 | 0 |
| 0.7944444444444444 | 0 |
| 0.7951388888888888 | 0 |
| 0.7958333333333334 | 0 |
| 0.7965277777777778 | 0 |
| 0.7972222222222222 | 0 |
| 0.7979166666666666 | 0 |
| 0.7986111111111112 | 0 |
| 0.7993055555555556 | 0 |
| 0.7999999999999999 | 0 |
| 0.8006944444444444 | 0 |
| 0.8013888888888889 | 0 |
| 0.8020833333333334 | 0 |
| 0.8027777777777777 | 0 |
| 0.8034722222222223 | 0 |
| 0.8041666666666667 | 0 |
| 0.8048611111111111 | 0 |
| 0.8055555555555555 | 0 |
| 0.80625 | 0 |
| 0.8069444444444445 | 0 |
| 0.8076388888888889 | 0 |
| 0.8083333333333332 | 0 |
| 0.8090277777777778 | 0 |
| 0.8097222222222222 | 0 |
| 0.8104166666666667 | 0 |
| 0.811111111111111 | 0 |
| 0.8118055555555556 | 0 |
| 0.8125 | 0 |
| 0.8131944444444444 | 0 |
| 0.813888888888889 | 0 |
| 0.8145833333333333 | 0 |
| 0.8152777777777778 | 0 |
| 0.8159722222222222 | 0 |
| 0.8166666666666668 | 0 |
| 0.8173611111111111 | 0 |
| 0.8180555555555555 | 0 |
| 0.81875 | 0 |
| 0.8194444444444445 | 0 |
| 0.8201388888888889 | 0 |
| 0.8208333333333333 | 0 |
| 0.8215277777777777 | 0 |
| 0.8222222222222223 | 0 |
| 0.8229166666666666 | 0 |
| 0.8236111111111111 | 0 |
| 0.8243055555555556 | 0 |
| 0.8250000000000001 | 0 |
| 0.8256944444444444 | 0 |
| 0.8263888888888888 | 0 |
| 0.8270833333333334 | 0 |
| 0.8277777777777778 | 0 |
| 0.8284722222222222 | 0 |
| 0.8291666666666666 | 0 |
| 0.8298611111111112 | 0 |
| 0.8305555555555556 | 0 |
| 0.8312499999999999 | 0 |
| 0.8319444444444444 | 0 |
| 0.8326388888888889 | 0 |
| 0.8333333333333334 | 0 |
| 0.8340277777777777 | 0 |
| 0.8347222222222223 | 0 |
| 0.8354166666666667 | 0 |
| 0.8361111111111111 | 0 |
| 0.8368055555555555 | 0 |
| 0.8375 | 0 |
| 0.8381944444444445 | 0 |
| 0.8388888888888889 | 0 |
| 0.8395833333333332 | 0 |
| 0.8402777777777778 | 0 |
| 0.8409722222222222 | 0 |
| 0.8416666666666667 | 0 |
| 0.842361111111111 | 0 |
| 0.8430555555555556 | 0 |
| 0.84375 | 0 |
| 0.8444444444444444 | 0 |
| 0.845138888888889 | 0 |
| 0.8458333333333333 | 0 |
| 0.8465277777777778 | 0 |
| 0.8472222222222222 | 0 |
| 0.8479166666666668 | 0 |
| 0.8486111111111111 | 0 |
| 0.8493055555555555 | 0 |
| 0.85 | 0 |
| 0.8506944444444445 | 0 |
| 0.8513888888888889 | 0 |
| 0.8520833333333333 | 0 |
| 0.8527777777777777 | 0 |
| 0.8534722222222223 | 0 |
| 0.8541666666666666 | 0 |
| 0.8548611111111111 | 0 |
| 0.8555555555555556 | 0 |
| 0.8562500000000001 | 0 |
| 0.8569444444444444 | 0 |
| 0.8576388888888888 | 0 |
| 0.8583333333333334 | 0 |
| 0.8590277777777778 | 0 |
| 0.8597222222222222 | 0 |
| 0.8604166666666666 | 0 |
| 0.8611111111111112 | 0 |
| 0.8618055555555556 | 0 |
| 0.8624999999999999 | 0 |
| 0.8631944444444444 | 0 |
| 0.8638888888888889 | 0 |
| 0.8645833333333334 | 0 |
| 0.8652777777777777 | 0 |
| 0.8659722222222223 | 0 |
| 0.8666666666666667 | 0 |
| 0.8673611111111111 | 0 |
| 0.8680555555555555 | 0 |
| 0.86875 | 0 |
| 0.8694444444444445 | 0 |
| 0.8701388888888889 | 0 |
| 0.8708333333333332 | 0 |
| 0.8715277777777778 | 0 |
| 0.8722222222222222 | 0 |
| 0.8729166666666667 | 0 |
| 0.873611111111111 | 0 |
| 0.8743055555555556 | 0 |
| 0.875 | 0 |
| 0.8756944444444444 | 0 |
| 0.876388888888889 | 0 |
| 0.8770833333333333 | 0 |
| 0.8777777777777778 | 0 |
| 0.8784722222222222 | 0 |
| 0.8791666666666668 | 0 |
| 0.8798611111111111 | 0 |
| 0.8805555555555555 | 0 |
| 0.88125 | 0 |
| 0.8819444444444445 | 0 |
| 0.8826388888888889 | 0 |
| 0.8833333333333333 | 0 |
| 0.8840277777777777 | 0 |
| 0.8847222222222223 | 0 |
| 0.8854166666666666 | 0 |
| 0.8861111111111111 | 0 |
| 0.8868055555555556 | 0 |
| 0.8875000000000001 | 0 |
| 0.8881944444444444 | 0 |
| 0.8888888888888888 | 0 |
| 0.8895833333333334 | 0 |
| 0.8902777777777778 | 0 |
| 0.8909722222222222 | 0 |
| 0.8916666666666666 | 0 |
| 0.8923611111111112 | 0 |
| 0.8930555555555556 | 0 |
| 0.8937499999999999 | 0 |
| 0.8944444444444444 | 0 |
| 0.8951388888888889 | 0 |
| 0.8958333333333334 | 0 |
| 0.8965277777777777 | 0 |
| 0.8972222222222223 | 0 |
| 0.8979166666666667 | 0 |
| 0.8986111111111111 | 0 |
| 0.8993055555555555 | 0 |
| 0.9 | 0 |
| 0.9006944444444445 | 0 |
| 0.9013888888888889 | 0 |
| 0.9020833333333332 | 0 |
| 0.9027777777777778 | 0 |
| 0.9034722222222222 | 0 |
| 0.9041666666666667 | 0 |
| 0.904861111111111 | 0 |
| 0.9055555555555556 | 0 |
| 0.90625 | 0 |
| 0.9069444444444444 | 0 |
| 0.907638888888889 | 0 |
| 0.9083333333333333 | 0 |
| 0.9090277777777778 | 0 |
| 0.9097222222222222 | 0 |
| 0.9104166666666668 | 0 |
| 0.9111111111111111 | 0 |
| 0.9118055555555555 | 0 |
| 0.9125 | 0 |
| 0.9131944444444445 | 0 |
| 0.9138888888888889 | 0 |
| 0.9145833333333333 | 0 |
| 0.9152777777777777 | 0 |
| 0.9159722222222223 | 0 |
| 0.9166666666666666 | 0 |
| 0.9173611111111111 | 0 |
| 0.9180555555555556 | 0 |
| 0.9187500000000001 | 0 |
| 0.9194444444444444 | 0 |
| 0.9201388888888888 | 0 |
| 0.9208333333333334 | 0 |
| 0.9215277777777778 | 0 |
| 0.9222222222222222 | 0 |
| 0.9229166666666666 | 0 |
| 0.9236111111111112 | 0 |
| 0.9243055555555556 | 0 |
| 0.9249999999999999 | 0 |
| 0.9256944444444444 | 0 |
| 0.9263888888888889 | 0 |
| 0.9270833333333334 | 0 |
| 0.9277777777777777 | 0 |
| 0.9284722222222223 | 0 |
| 0.9291666666666667 | 0 |
| 0.9298611111111111 | 0 |
| 0.9305555555555555 | 0 |
| 0.93125 | 0 |
| 0.9319444444444445 | 0 |
| 0.9326388888888889 | 0 |
| 0.9333333333333332 | 0 |
| 0.9340277777777778 | 0 |
| 0.9347222222222222 | 0 |
| 0.9354166666666667 | 0 |
| 0.936111111111111 | 0 |
| 0.9368055555555556 | 0 |
| 0.9375 | 0 |
| 0.9381944444444444 | 0 |
| 0.938888888888889 | 0 |
| 0.9395833333333333 | 0 |
| 0.9402777777777778 | 0 |
| 0.9409722222222222 | 0 |
| 0.9416666666666668 | 0 |
| 0.9423611111111111 | 0 |
| 0.9430555555555555 | 0 |
| 0.94375 | 0 |
| 0.9444444444444445 | 0 |
| 0.9451388888888889 | 0 |
| 0.9458333333333333 | 0 |
| 0.9465277777777777 | 0 |
| 0.9472222222222223 | 0 |
| 0.9479166666666666 | 0 |
| 0.9486111111111111 | 0 |
| 0.9493055555555556 | 0 |
| 0.9500000000000001 | 0 |
| 0.9506944444444444 | 0 |
| 0.9513888888888888 | 0 |
| 0.9520833333333334 | 0 |
| 0.9527777777777778 | 0 |
| 0.9534722222222222 | 0 |
| 0.9541666666666666 | 0 |
| 0.9548611111111112 | 0 |
| 0.9555555555555556 | 0 |
| 0.9562499999999999 | 0 |
| 0.9569444444444444 | 0 |
| 0.9576388888888889 | 0 |
| 0.9583333333333334 | 0 |
| 0.9590277777777777 | 0 |
| 0.9597222222222223 | 0 |
| 0.9604166666666667 | 0 |
| 0.9611111111111111 | 0 |
| 0.9618055555555555 | 0 |
| 0.9625 | 0 |
| 0.9631944444444445 | 0 |
| 0.9638888888888889 | 0 |
| 0.9645833333333332 | 0 |
| 0.9652777777777778 | 0 |
| 0.9659722222222222 | 0 |
| 0.9666666666666667 | 0 |
| 0.967361111111111 | 0 |
| 0.9680555555555556 | 0 |
| 0.96875 | 0 |
| 0.9694444444444444 | 0 |
| 0.970138888888889 | 0 |
| 0.9708333333333333 | 0 |
| 0.9715277777777778 | 0 |
| 0.9722222222222222 | 0 |
| 0.9729166666666668 | 0 |
| 0.9736111111111111 | 0 |
| 0.9743055555555555 | 0 |
| 0.975 | 0 |
| 0.9756944444444445 | 0 |
| 0.9763888888888889 | 0 |
| 0.9770833333333333 | 0 |
| 0.9777777777777777 | 0 |
| 0.9784722222222223 | 0 |
| 0.9791666666666666 | 0 |
| 0.9798611111111111 | 0 |
| 0.9805555555555556 | 0 |
| 0.9812500000000001 | 0 |
| 0.9819444444444444 | 0 |
| 0.9826388888888888 | 0 |
| 0.9833333333333334 | 0 |
| 0.9840277777777778 | 0 |
| 0.9847222222222222 | 0 |
| 0.9854166666666666 | 0 |
| 0.9861111111111112 | 0 |
| 0.9868055555555556 | 0 |
| 0.9874999999999999 | 0 |
| 0.9881944444444444 | 0 |
| 0.9888888888888889 | 0 |
| 0.9895833333333334 | 0 |
| 0.9902777777777777 | 0 |
| 0.9909722222222223 | 0 |
| 0.9916666666666667 | 0 |
| 0.9923611111111111 | 0 |
| 0.9930555555555555 | 0 |
| 0.99375 | 0 |
| 0.9944444444444445 | 0 |
| 0.9951388888888889 | 0 |
| 0.9958333333333332 | 0 |
| 0.9965277777777778 | 0 |
| 0.9972222222222222 | 0 |
| 0.9979166666666667 | 0 |
| 0.998611111111111 | 0 |
| 0.9993055555555556 | 0 |